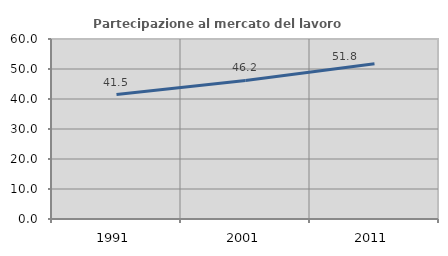
| Category | Partecipazione al mercato del lavoro  femminile |
|---|---|
| 1991.0 | 41.493 |
| 2001.0 | 46.197 |
| 2011.0 | 51.756 |